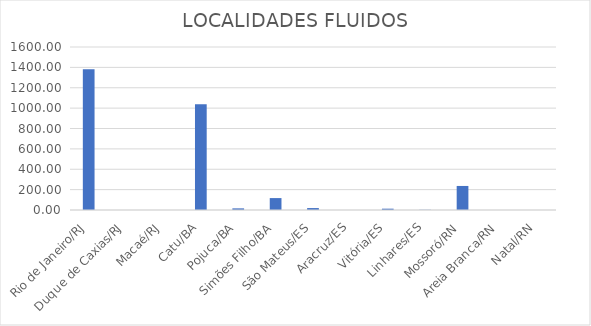
| Category | Series 0 |
|---|---|
| Rio de Janeiro/RJ | 1381 |
| Duque de Caxias/RJ | 0 |
| Macaé/RJ | 0 |
| Catu/BA | 1039 |
| Pojuca/BA | 16 |
| Simões Filho/BA | 117 |
| São Mateus/ES | 19 |
| Aracruz/ES | 0 |
| Vitória/ES | 13 |
| Linhares/ES | 2 |
| Mossoró/RN | 236 |
| Areia Branca/RN | 0 |
| Natal/RN | 0 |